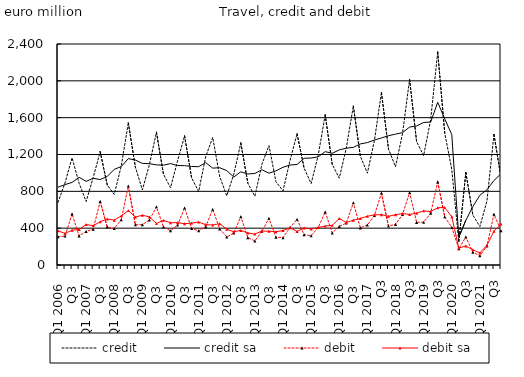
| Category | credit | credit sa  | debit | debit sa |
|---|---|---|---|---|
| Q1 2006 | 679.337 | 844.421 | 307.271 | 371.174 |
| Q2  | 892.136 | 873.293 | 313.782 | 343.165 |
| Q3  | 1164.045 | 896.914 | 555.145 | 377.995 |
| Q4  | 887.709 | 952.726 | 315.879 | 386.079 |
| Q1 2007 | 689.762 | 908.056 | 364.279 | 439.46 |
| Q2  | 948.548 | 941.46 | 389.363 | 427.803 |
| Q3  | 1231.074 | 927.904 | 690.234 | 468.733 |
| Q4  | 869.503 | 961.337 | 412.263 | 499.748 |
| Q1 2008 | 766.549 | 1039.262 | 397.096 | 487.276 |
| Q2  | 1076.434 | 1068.748 | 491.893 | 533.173 |
| Q3  | 1543.587 | 1155.171 | 857.249 | 590.528 |
| Q4  | 1064.507 | 1139.917 | 436.927 | 521.257 |
| Q1 2009 | 815.491 | 1103.445 | 438.322 | 540.697 |
| Q2  | 1090.114 | 1099.893 | 488.923 | 522.031 |
| Q3  | 1441.905 | 1087.187 | 632.304 | 450.376 |
| Q4  | 986.07 | 1083.444 | 414.09 | 484.629 |
| Q1 2010 | 838.672 | 1101.479 | 370.876 | 459.295 |
| Q2  | 1128.562 | 1080.051 | 433.344 | 459.828 |
| Q3  | 1402.495 | 1078.984 | 621.195 | 448.661 |
| Q4  | 947.183 | 1069.93 | 396.319 | 455.258 |
| Q1 2011 | 796.702 | 1067.655 | 371.343 | 466.263 |
| Q2  | 1175.533 | 1112.035 | 413.513 | 437.94 |
| Q3  | 1385.695 | 1052.082 | 605.122 | 434.43 |
| Q4  | 959.735 | 1056.399 | 392.273 | 449.228 |
| Q1 2012 | 751.657 | 1024.677 | 304.254 | 388.477 |
| Q2  | 985.102 | 955.559 | 346.787 | 360.691 |
| Q3  | 1325.465 | 1011.843 | 525.087 | 375.941 |
| Q4  | 888.582 | 988.415 | 297.007 | 347.633 |
| Q1 2013 | 746.922 | 994.039 | 261.495 | 335.64 |
| Q2  | 1093.93 | 1034.654 | 366.882 | 368.931 |
| Q3  | 1296.578 | 996.854 | 506.66 | 366.819 |
| Q4  | 903.69 | 1022.312 | 301.517 | 361.241 |
| Q1 2014 | 806.291 | 1061.385 | 296.729 | 374.484 |
| Q2  | 1135.395 | 1085.494 | 408.561 | 404.47 |
| Q3  | 1425.538 | 1091.574 | 495.887 | 364.285 |
| Q4  | 1051.374 | 1158.739 | 329.668 | 401.659 |
| Q1 2015 | 884.128 | 1161.867 | 318.579 | 391.222 |
| Q2  | 1189.864 | 1174.786 | 406.716 | 407.174 |
| Q3  | 1631.551 | 1230.99 | 576.918 | 422.692 |
| Q4 | 1092.323 | 1212.956 | 347.706 | 430.499 |
| Q1 2016 | 942.977 | 1249.954 | 419.301 | 504.858 |
| Q2  | 1270.44 | 1268.478 | 455.378 | 460.747 |
| Q3  | 1725.735 | 1277.59 | 676.232 | 486.532 |
| Q4 | 1181.072 | 1314.603 | 403.007 | 505.552 |
| Q1 2017 | 997.795 | 1329.427 | 434.375 | 529.726 |
| Q2  | 1352.574 | 1357.046 | 538.426 | 544.618 |
| Q3 | 1872.669 | 1379.687 | 781.288 | 546.824 |
| Q4 | 1260.207 | 1404.364 | 422.236 | 528.309 |
| Q1 2018 | 1066.171 | 1420.707 | 440.941 | 546.666 |
| Q2  | 1431.04 | 1437.897 | 547.946 | 559.231 |
| Q3 | 2014.263 | 1497.8 | 787.069 | 548.835 |
| Q4 | 1339.353 | 1510.149 | 462.844 | 562.318 |
| Q1 2019 | 1188.096 | 1548.068 | 464.66 | 587.898 |
| Q2  | 1578.689 | 1552.216 | 562.257 | 579.64 |
| Q3 | 2314.971 | 1767.375 | 902.346 | 621.725 |
| Q4 | 1432.819 | 1587.367 | 522.666 | 624.051 |
| Q1 2020 | 1037.795 | 1416.163 | 408.813 | 524.791 |
| Q2  | 256.035 | 302.395 | 176.886 | 183.804 |
| Q3 | 1004.743 | 485.3 | 304.696 | 207.398 |
| Q4 | 540.764 | 634.919 | 137.819 | 164.608 |
| Q1 2021 | 418.129 | 758.347 | 101.103 | 131.539 |
| Q2  | 694.346 | 816.373 | 205.082 | 214.983 |
| Q3 | 1417.91 | 917.747 | 552.068 | 367.074 |
| Q4 | 949.171 | 990.909 | 373.026 | 444.178 |